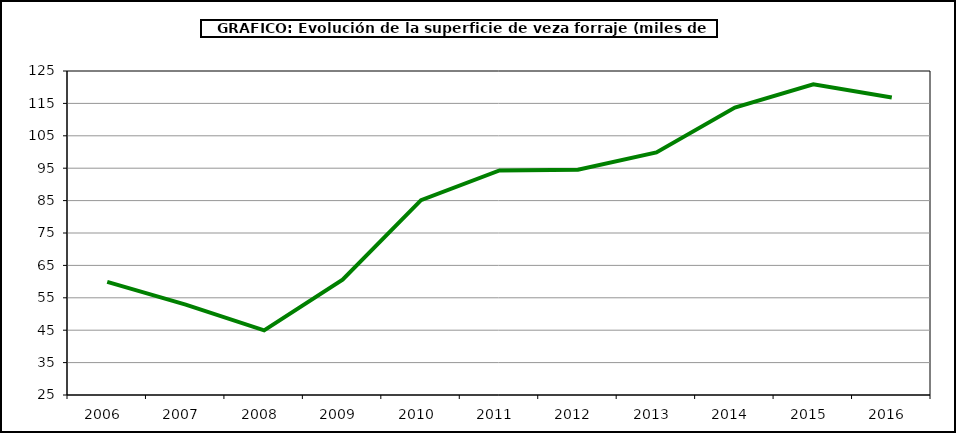
| Category | Superficie |
|---|---|
| 2006.0 | 59.927 |
| 2007.0 | 52.887 |
| 2008.0 | 44.94 |
| 2009.0 | 60.618 |
| 2010.0 | 85.154 |
| 2011.0 | 94.325 |
| 2012.0 | 94.499 |
| 2013.0 | 99.877 |
| 2014.0 | 113.725 |
| 2015.0 | 120.903 |
| 2016.0 | 116.796 |